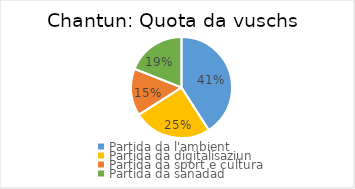
| Category | Quota da vuschs |
|---|---|
| Partida da l'ambient | 0.409 |
| Partida da digitalisaziun | 0.25 |
| Partida da sport e cultura  | 0.15 |
| Partida da sanadad  | 0.19 |